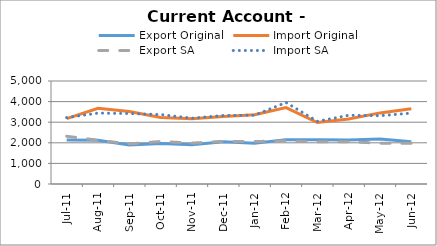
| Category | Export Original | Import Original | Export SA | Import SA |
|---|---|---|---|---|
| 2011-07-11 | 2138 | 3172 | 2317 | 3222 |
| 2011-08-11 | 2121 | 3673 | 2123 | 3443 |
| 2011-09-11 | 1895 | 3522 | 1945 | 3419 |
| 2011-10-11 | 1970 | 3230 | 2064 | 3371 |
| 2011-11-11 | 1900 | 3172 | 1985 | 3193 |
| 2011-12-11 | 2056 | 3276 | 2072 | 3326 |
| 2012-01-11 | 1974 | 3366 | 2062 | 3340 |
| 2012-02-11 | 2154 | 3712 | 2090 | 3957 |
| 2012-03-11 | 2142 | 2984 | 2048 | 3040 |
| 2012-04-11 | 2138 | 3158 | 2051 | 3336 |
| 2012-05-11 | 2179 | 3452 | 1983 | 3315 |
| 2012-06-11 | 2051 | 3653 | 1976 | 3442 |